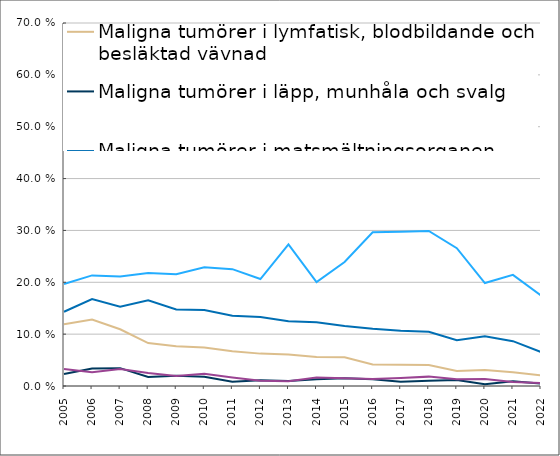
| Category | Maligna tumörer i lymfatisk, blodbildande och besläktad vävnad | Maligna tumörer i läpp, munhåla och svalg | Maligna tumörer i matsmältningsorganen | Maligna tumörer i mesotelial (kroppshåletäckande) vävnad och mjukvävnad | Maligna tumörer i tyreoidea och andra endokrina körtlar |
|---|---|---|---|---|---|
| 2005.0 | 0.119 | 0.023 | 0.143 | 0.197 | 0.033 |
| 2006.0 | 0.128 | 0.034 | 0.168 | 0.213 | 0.026 |
| 2007.0 | 0.109 | 0.034 | 0.153 | 0.211 | 0.033 |
| 2008.0 | 0.083 | 0.017 | 0.165 | 0.218 | 0.025 |
| 2009.0 | 0.077 | 0.02 | 0.147 | 0.216 | 0.019 |
| 2010.0 | 0.074 | 0.018 | 0.147 | 0.229 | 0.024 |
| 2011.0 | 0.067 | 0.008 | 0.135 | 0.225 | 0.016 |
| 2012.0 | 0.062 | 0.011 | 0.133 | 0.206 | 0.01 |
| 2013.0 | 0.061 | 0.01 | 0.125 | 0.273 | 0.009 |
| 2014.0 | 0.056 | 0.013 | 0.123 | 0.2 | 0.016 |
| 2015.0 | 0.056 | 0.015 | 0.116 | 0.239 | 0.015 |
| 2016.0 | 0.041 | 0.013 | 0.11 | 0.296 | 0.013 |
| 2017.0 | 0.041 | 0.008 | 0.107 | 0.297 | 0.016 |
| 2018.0 | 0.04 | 0.01 | 0.105 | 0.299 | 0.018 |
| 2019.0 | 0.029 | 0.012 | 0.088 | 0.266 | 0.013 |
| 2020.0 | 0.031 | 0.004 | 0.096 | 0.199 | 0.013 |
| 2021.0 | 0.027 | 0.009 | 0.087 | 0.214 | 0.008 |
| 2022.0 | 0.02 | 0.005 | 0.066 | 0.175 | 0.006 |